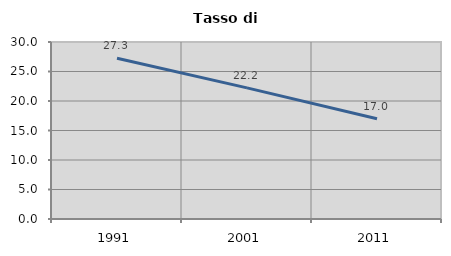
| Category | Tasso di disoccupazione   |
|---|---|
| 1991.0 | 27.251 |
| 2001.0 | 22.219 |
| 2011.0 | 16.991 |